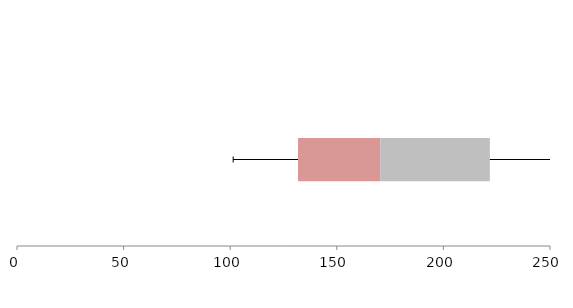
| Category | Series 1 | Series 2 | Series 3 |
|---|---|---|---|
| 0 | 131.816 | 38.558 | 51.426 |